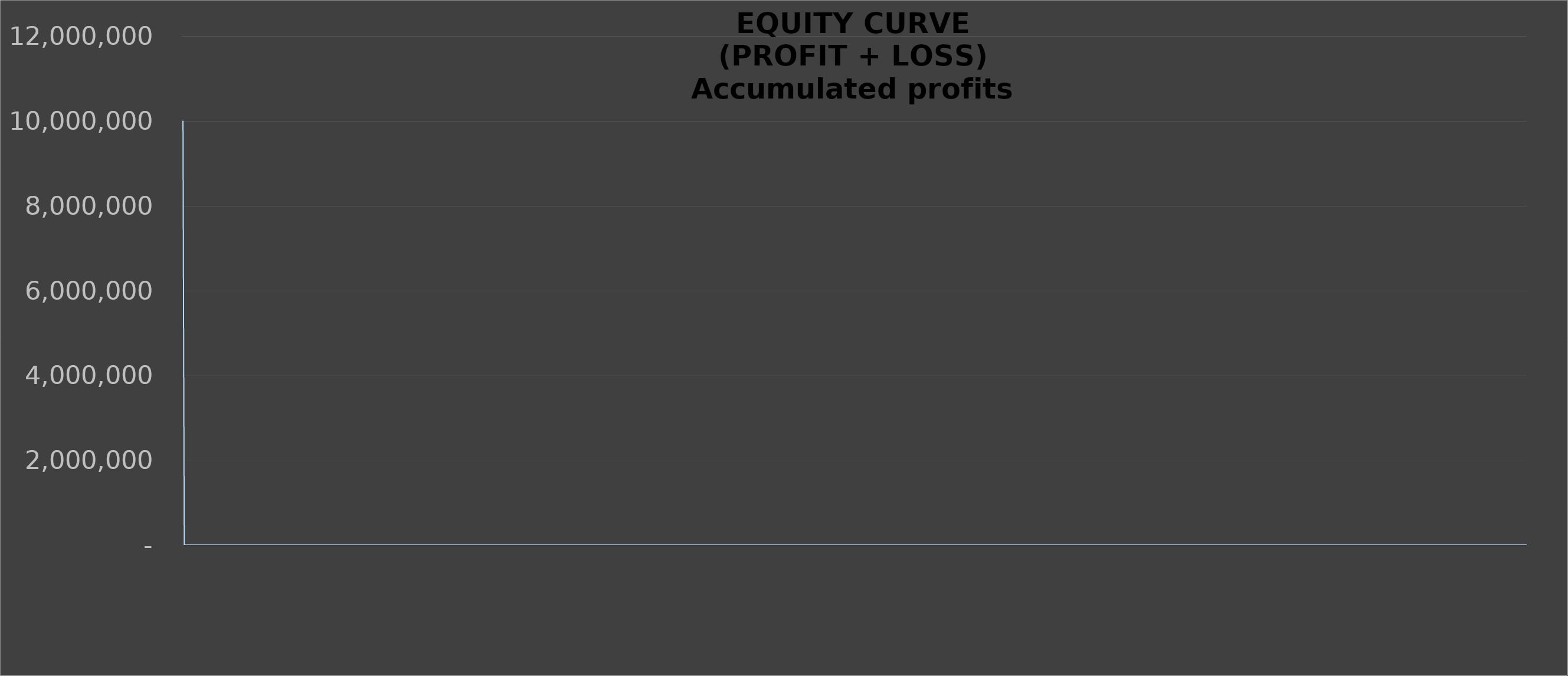
| Category | Acc P% |
|---|---|
|  | 10000000 |
|  | 0 |
|  | 0 |
|  | 0 |
|  | 0 |
|  | 0 |
|  | 0 |
|  | 0 |
|  | 0 |
|  | 0 |
|  | 0 |
|  | 0 |
|  | 0 |
|  | 0 |
|  | 0 |
|  | 0 |
|  | 0 |
|  | 0 |
|  | 0 |
|  | 0 |
|  | 0 |
|  | 0 |
|  | 0 |
|  | 0 |
|  | 0 |
|  | 0 |
|  | 0 |
|  | 0 |
|  | 0 |
|  | 0 |
|  | 0 |
|  | 0 |
|  | 0 |
|  | 0 |
|  | 0 |
|  | 0 |
|  | 0 |
|  | 0 |
|  | 0 |
|  | 0 |
|  | 0 |
|  | 0 |
|  | 0 |
|  | 0 |
|  | 0 |
|  | 0 |
|  | 0 |
|  | 0 |
|  | 0 |
|  | 0 |
|  | 0 |
|  | 0 |
|  | 0 |
|  | 0 |
|  | 0 |
|  | 0 |
|  | 0 |
|  | 0 |
|  | 0 |
|  | 0 |
|  | 0 |
|  | 0 |
|  | 0 |
|  | 0 |
|  | 0 |
|  | 0 |
|  | 0 |
|  | 0 |